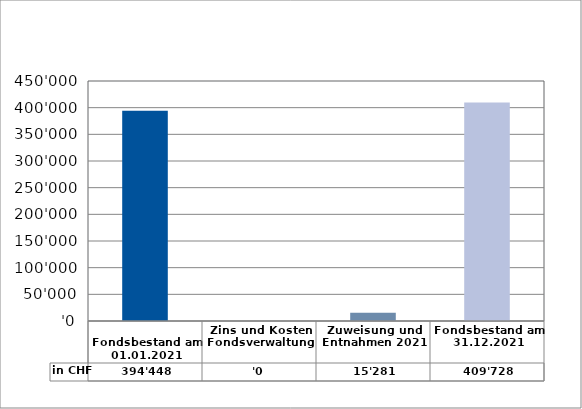
| Category | in CHF |
|---|---|
| 
Fondsbestand am 01.01.2021

 | 394447.5 |
| Zins und Kosten Fondsverwaltung | 0 |
| Zuweisung und Entnahmen 2021 | 15280.6 |
| Fondsbestand am 31.12.2021 | 409728.1 |